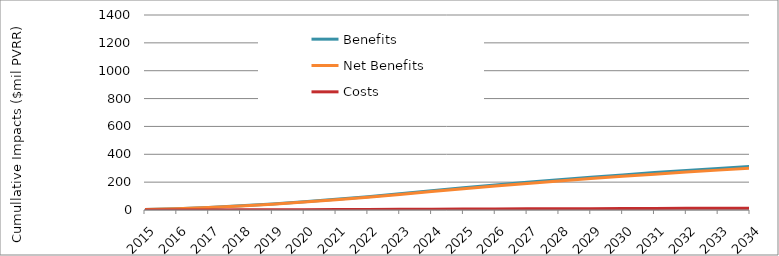
| Category | Benefits | Net Benefits | Costs |
|---|---|---|---|
| 2015.0 | 3254757.041 | 3119142.165 | 135614.877 |
| 2016.0 | 9486614.125 | 9091338.537 | 395275.589 |
| 2017.0 | 18435679.038 | 17667525.744 | 768153.293 |
| 2018.0 | 29858814.028 | 28614696.777 | 1244117.251 |
| 2019.0 | 43528679.36 | 41714984.387 | 1813694.973 |
| 2020.0 | 59232827.969 | 56764793.471 | 2468034.499 |
| 2021.0 | 76772848.612 | 73573979.92 | 3198868.692 |
| 2022.0 | 95963555.016 | 91965073.557 | 3998481.459 |
| 2023.0 | 116632218.666 | 111772542.888 | 4859675.778 |
| 2024.0 | 138617842.981 | 132842099.523 | 5775743.458 |
| 2025.0 | 159665691.851 | 153012954.69 | 6652737.16 |
| 2026.0 | 179815765.177 | 172323441.628 | 7492323.549 |
| 2027.0 | 199106356.702 | 190810258.506 | 8296098.196 |
| 2028.0 | 217574126.788 | 208508538.171 | 9065588.616 |
| 2029.0 | 235254172.083 | 225451914.913 | 9802257.17 |
| 2030.0 | 252180092.224 | 241672588.381 | 10507503.843 |
| 2031.0 | 268384053.685 | 257201384.782 | 11182668.904 |
| 2032.0 | 283896850.914 | 272067815.459 | 11829035.455 |
| 2033.0 | 298747964.848 | 286300132.98 | 12447831.869 |
| 2034.0 | 312965618.947 | 299925384.824 | 13040234.123 |